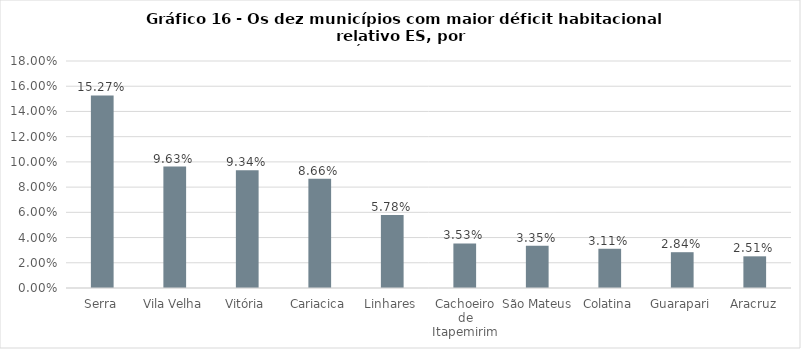
| Category | Series 0 |
|---|---|
| Serra | 0.153 |
| Vila Velha | 0.096 |
| Vitória | 0.093 |
| Cariacica | 0.087 |
| Linhares | 0.058 |
| Cachoeiro de Itapemirim | 0.035 |
| São Mateus | 0.033 |
| Colatina | 0.031 |
| Guarapari | 0.028 |
| Aracruz | 0.025 |